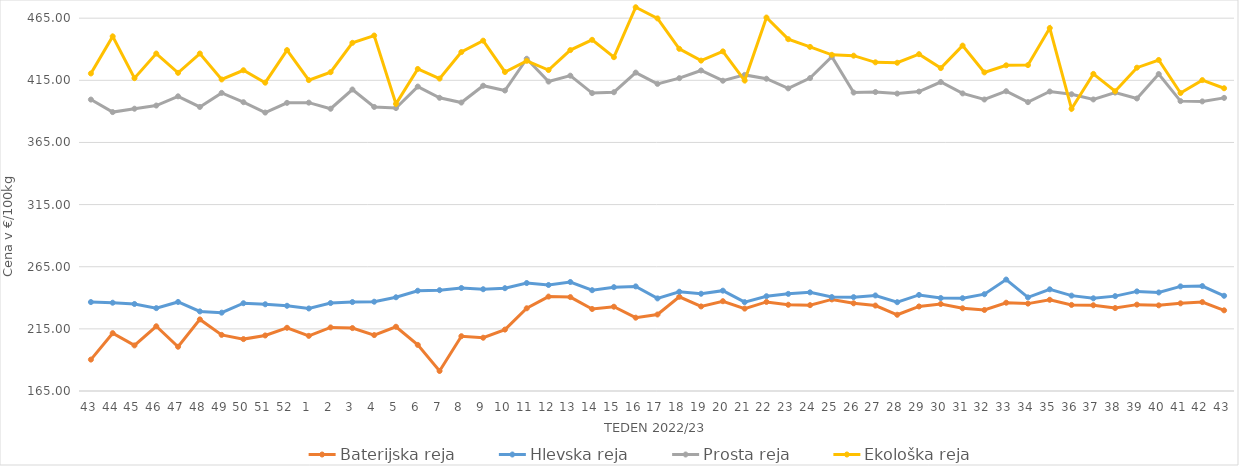
| Category | Baterijska reja | Hlevska reja | Prosta reja | Ekološka reja |
|---|---|---|---|---|
| 43.0 | 190.28 | 236.56 | 399.51 | 420.52 |
| 44.0 | 211.53 | 236.04 | 389.44 | 450.35 |
| 45.0 | 201.69 | 235.01 | 392.15 | 416.72 |
| 46.0 | 217.08 | 231.68 | 394.71 | 436.55 |
| 47.0 | 200.62 | 236.65 | 402.12 | 421.03 |
| 48.0 | 222.61 | 229.05 | 393.56 | 436.55 |
| 49.0 | 210.16 | 228.03 | 404.87 | 415.69 |
| 50.0 | 206.76 | 235.63 | 397.4 | 423.1 |
| 51.0 | 209.69 | 234.79 | 389.05 | 413.1 |
| 52.0 | 215.87 | 233.58 | 396.87 | 439.31 |
| 1.0 | 209.37 | 231.41 | 397.04 | 415.17 |
| 2.0 | 216.15 | 235.78 | 392.13 | 421.55 |
| 3.0 | 215.63 | 236.58 | 407.61 | 445.17 |
| 4.0 | 210 | 236.85 | 393.58 | 451.04 |
| 5.0 | 216.7 | 240.42 | 392.67 | 396.03 |
| 6.0 | 202.1 | 245.67 | 409.97 | 424.14 |
| 7.0 | 181.11 | 246.12 | 400.94 | 416.38 |
| 8.0 | 209.08 | 247.88 | 397.11 | 437.76 |
| 9.0 | 207.87 | 246.89 | 410.64 | 446.9 |
| 10.0 | 214.42 | 247.73 | 406.8 | 421.72 |
| 11.0 | 231.56 | 251.88 | 432.34 | 430.69 |
| 12.0 | 240.97 | 250.3 | 414 | 423.28 |
| 13.0 | 240.55 | 252.7 | 418.74 | 439.31 |
| 14.0 | 230.99 | 246.12 | 404.72 | 447.59 |
| 15.0 | 232.82 | 248.56 | 405.42 | 433.62 |
| 16.0 | 224 | 249.17 | 421.22 | 473.79 |
| 17.0 | 226.57 | 239.5 | 412.13 | 464.83 |
| 18.0 | 240.83 | 244.89 | 416.74 | 440.35 |
| 19.0 | 233.05 | 243.26 | 422.93 | 430.86 |
| 20.0 | 237.25 | 245.73 | 414.68 | 438.28 |
| 21.0 | 231.3 | 236.5 | 419.36 | 414.83 |
| 22.0 | 236.67 | 241.27 | 416.27 | 465.52 |
| 23.0 | 234.39 | 243.16 | 408.53 | 448.1 |
| 24.0 | 234.08 | 244.37 | 416.78 | 441.9 |
| 25.0 | 238.69 | 240.6 | 434.05 | 435.52 |
| 26.0 | 235.57 | 240.51 | 405.15 | 434.83 |
| 27.0 | 233.75 | 241.89 | 405.58 | 429.48 |
| 28.0 | 226.35 | 236.46 | 404.32 | 429.14 |
| 29.0 | 233.03 | 242.31 | 405.96 | 436.04 |
| 30.0 | 235 | 239.8 | 413.63 | 424.83 |
| 31.0 | 231.55 | 239.67 | 404.46 | 442.93 |
| 32.0 | 230.2 | 242.89 | 399.57 | 421.38 |
| 33.0 | 236.04 | 254.68 | 406.23 | 427.07 |
| 34.0 | 235.32 | 240.35 | 397.45 | 427.24 |
| 35.0 | 238.39 | 246.82 | 406 | 457.07 |
| 36.0 | 234.27 | 241.75 | 403.79 | 392.07 |
| 37.0 | 234 | 239.58 | 399.61 | 420.17 |
| 38.0 | 231.74 | 241.34 | 405.14 | 406.21 |
| 39.0 | 234.5 | 245.15 | 400.39 | 425.17 |
| 40.0 | 233.92 | 244.29 | 420.04 | 431.38 |
| 41.0 | 235.54 | 249.18 | 398.28 | 404.83 |
| 42.0 | 236.54 | 249.42 | 398.03 | 415.17 |
| 43.0 | 229.92 | 241.62 | 400.86 | 408.62 |